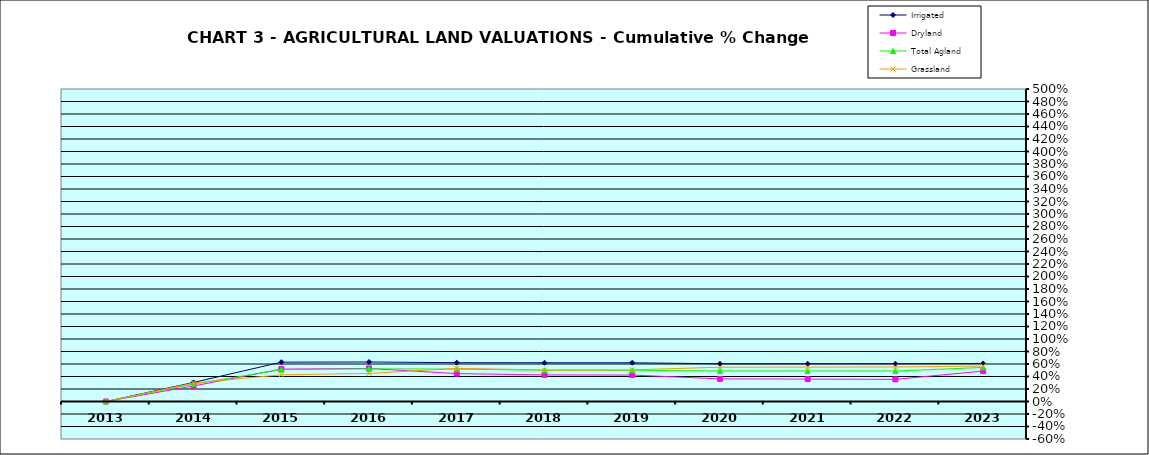
| Category | Irrigated | Dryland | Total Agland | Grassland |
|---|---|---|---|---|
| 2013.0 | 0 | 0 | 0 | 0 |
| 2014.0 | 0.305 | 0.249 | 0.279 | 0.296 |
| 2015.0 | 0.629 | 0.518 | 0.51 | 0.427 |
| 2016.0 | 0.632 | 0.529 | 0.523 | 0.449 |
| 2017.0 | 0.621 | 0.446 | 0.518 | 0.531 |
| 2018.0 | 0.62 | 0.426 | 0.5 | 0.504 |
| 2019.0 | 0.62 | 0.423 | 0.5 | 0.506 |
| 2020.0 | 0.604 | 0.362 | 0.488 | 0.549 |
| 2021.0 | 0.604 | 0.359 | 0.488 | 0.551 |
| 2022.0 | 0.604 | 0.355 | 0.487 | 0.553 |
| 2023.0 | 0.609 | 0.487 | 0.545 | 0.567 |